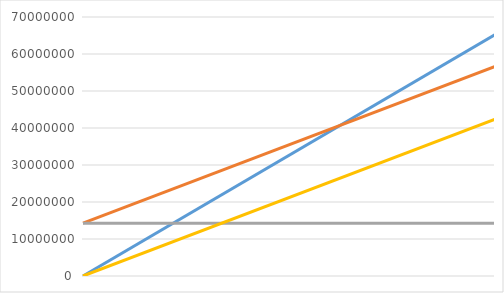
| Category | I x V | CT | CF | CV |
|---|---|---|---|---|
| 0.0 | 0 | 14271426.891 | 14271426.891 | 0 |
| 45000.0 | 65250000 | 56646995.399 | 14271426.891 | 42375568.508 |